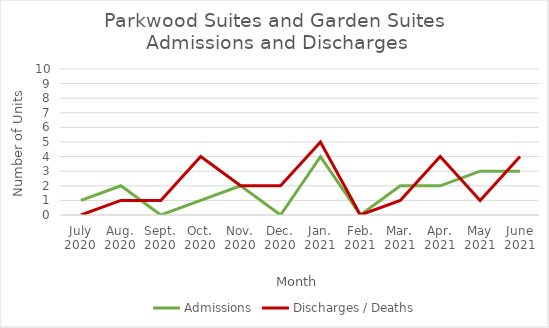
| Category | Admissions | Discharges / Deaths |
|---|---|---|
| July
2020 | 1 | 0 |
| Aug.
2020 | 2 | 1 |
| Sept.
2020 | 0 | 1 |
| Oct.
2020 | 1 | 4 |
| Nov.
2020 | 2 | 2 |
| Dec.
2020 | 0 | 2 |
| Jan.
2021 | 4 | 5 |
| Feb.
2021 | 0 | 0 |
| Mar.
2021 | 2 | 1 |
| Apr.
2021 | 2 | 4 |
| May
2021 | 3 | 1 |
| June
2021 | 3 | 4 |